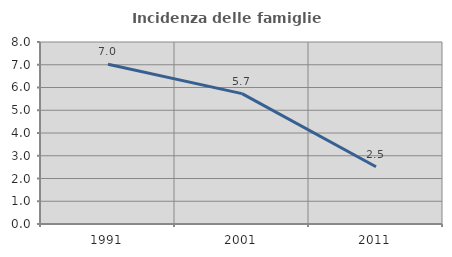
| Category | Incidenza delle famiglie numerose |
|---|---|
| 1991.0 | 7.02 |
| 2001.0 | 5.732 |
| 2011.0 | 2.516 |